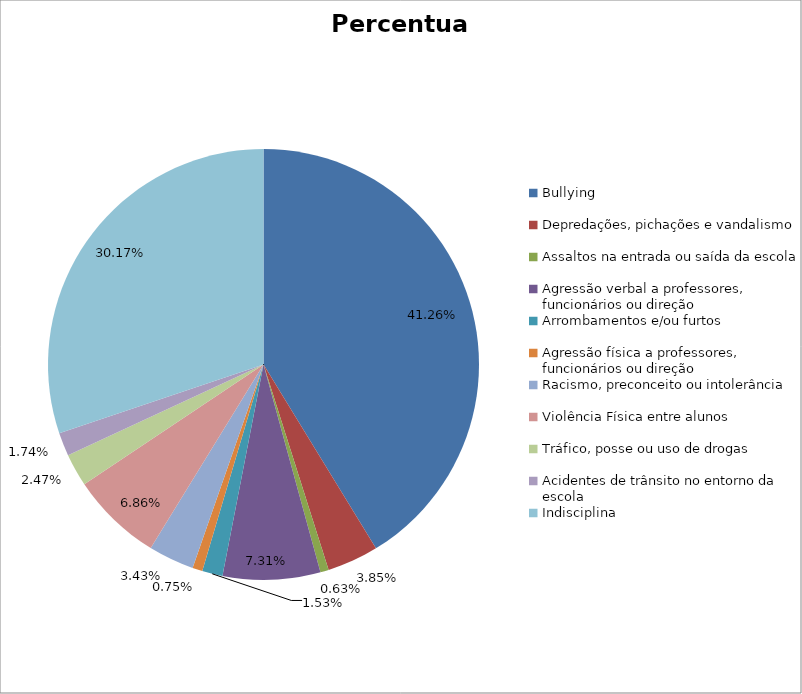
| Category | Percentual |
|---|---|
| Bullying | 0.413 |
| Depredações, pichações e vandalismo | 0.038 |
| Assaltos na entrada ou saída da escola | 0.006 |
| Agressão verbal a professores, funcionários ou direção | 0.073 |
| Arrombamentos e/ou furtos | 0.015 |
| Agressão física a professores, funcionários ou direção | 0.008 |
| Racismo, preconceito ou intolerância | 0.034 |
| Violência Física entre alunos | 0.069 |
| Tráfico, posse ou uso de drogas | 0.025 |
| Acidentes de trânsito no entorno da escola | 0.017 |
| Indisciplina | 0.302 |